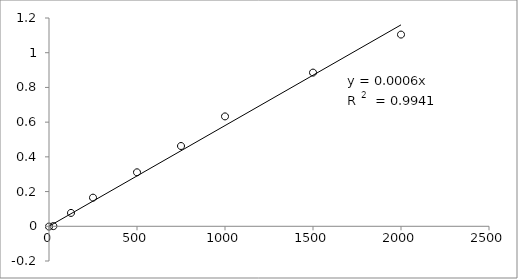
| Category | Series 0 |
|---|---|
| 2000.0 | 1.104 |
| 1500.0 | 0.886 |
| 1000.0 | 0.633 |
| 750.0 | 0.462 |
| 500.0 | 0.311 |
| 250.0 | 0.165 |
| 125.0 | 0.077 |
| 25.0 | 0.001 |
| 0.0 | -0.001 |